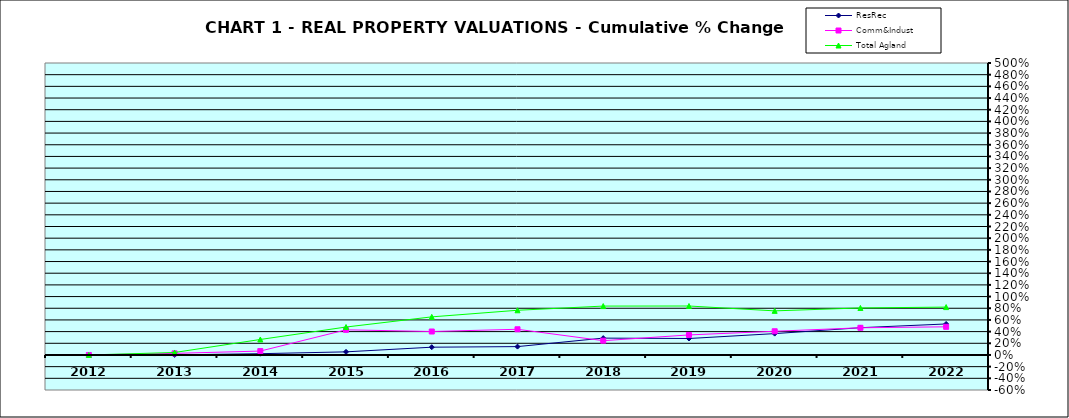
| Category | ResRec | Comm&Indust | Total Agland |
|---|---|---|---|
| 2012.0 | 0 | 0 | 0 |
| 2013.0 | 0.001 | 0.027 | 0.042 |
| 2014.0 | 0.022 | 0.067 | 0.265 |
| 2015.0 | 0.053 | 0.43 | 0.479 |
| 2016.0 | 0.133 | 0.402 | 0.652 |
| 2017.0 | 0.143 | 0.44 | 0.765 |
| 2018.0 | 0.289 | 0.245 | 0.837 |
| 2019.0 | 0.282 | 0.343 | 0.838 |
| 2020.0 | 0.366 | 0.406 | 0.755 |
| 2021.0 | 0.467 | 0.466 | 0.805 |
| 2022.0 | 0.531 | 0.482 | 0.82 |